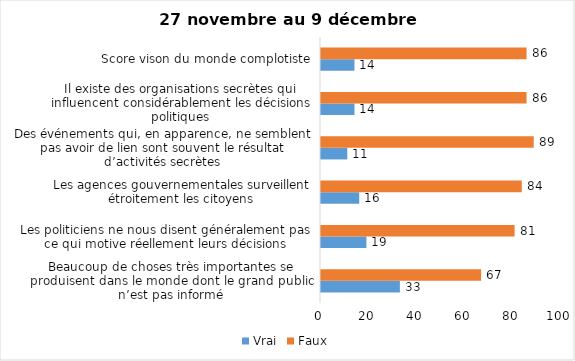
| Category | Vrai | Faux |
|---|---|---|
| Beaucoup de choses très importantes se produisent dans le monde dont le grand public n’est pas informé | 33 | 67 |
| Les politiciens ne nous disent généralement pas ce qui motive réellement leurs décisions | 19 | 81 |
| Les agences gouvernementales surveillent étroitement les citoyens | 16 | 84 |
| Des événements qui, en apparence, ne semblent pas avoir de lien sont souvent le résultat d’activités secrètes | 11 | 89 |
| Il existe des organisations secrètes qui influencent considérablement les décisions politiques | 14 | 86 |
| Score vison du monde complotiste | 14 | 86 |